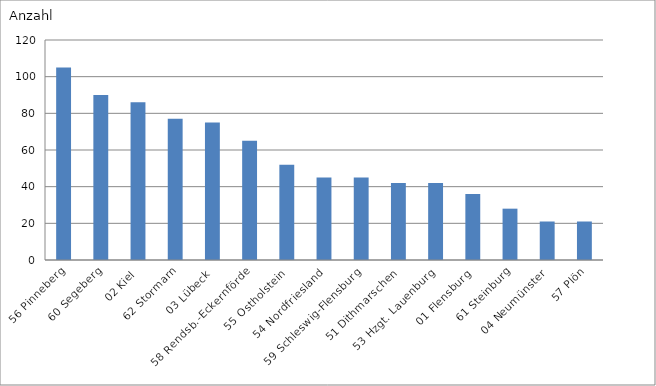
| Category | 56 Pinneberg |
|---|---|
| 56 Pinneberg | 105 |
| 60 Segeberg | 90 |
| 02 Kiel | 86 |
| 62 Stormarn | 77 |
| 03 Lübeck | 75 |
| 58 Rendsb.-Eckernförde | 65 |
| 55 Ostholstein | 52 |
| 54 Nordfriesland | 45 |
| 59 Schleswig-Flensburg | 45 |
| 51 Dithmarschen | 42 |
| 53 Hzgt. Lauenburg | 42 |
| 01 Flensburg | 36 |
| 61 Steinburg | 28 |
| 04 Neumünster | 21 |
| 57 Plön | 21 |